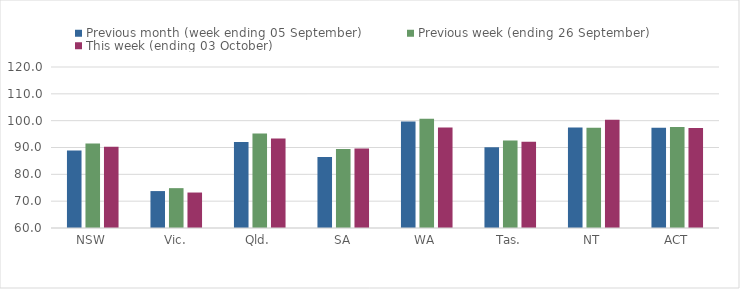
| Category | Previous month (week ending 05 September) | Previous week (ending 26 September) | This week (ending 03 October) |
|---|---|---|---|
| NSW | 88.88 | 91.46 | 90.28 |
| Vic. | 73.76 | 74.85 | 73.22 |
| Qld. | 92.01 | 95.18 | 93.34 |
| SA | 86.48 | 89.47 | 89.6 |
| WA | 99.67 | 100.74 | 97.43 |
| Tas. | 90.11 | 92.59 | 92.14 |
| NT | 97.44 | 97.35 | 100.36 |
| ACT | 97.39 | 97.65 | 97.26 |